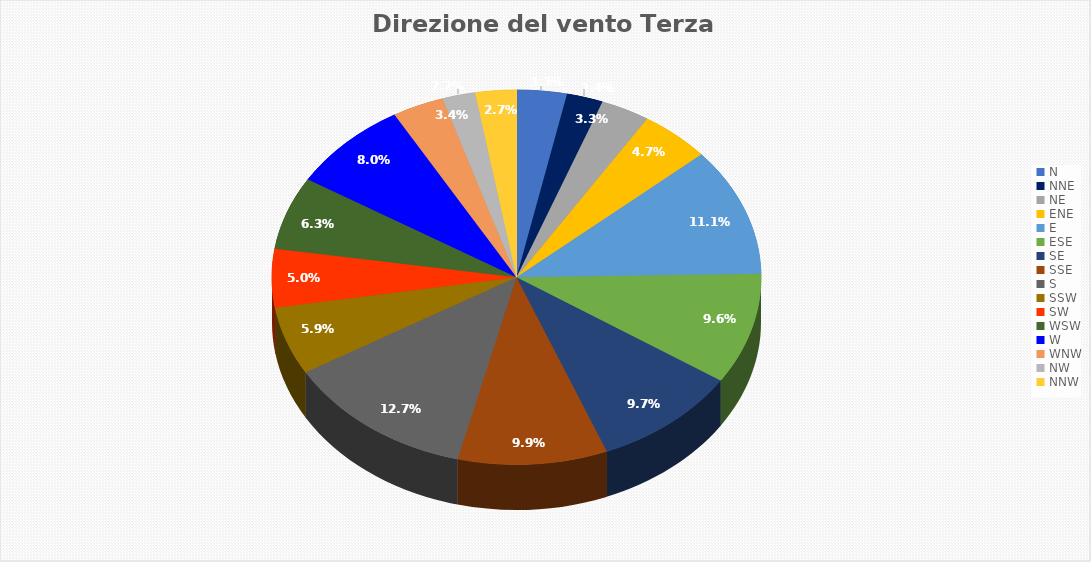
| Category | Percentuale |
|---|---|
| N | 3.313 |
| NNE | 2.398 |
| NE | 3.25 |
| ENE | 4.67 |
| E | 11.076 |
| ESE | 9.593 |
| SE | 9.688 |
| SSE | 9.877 |
| S | 12.654 |
| SSW | 5.869 |
| SW | 5.049 |
| WSW | 6.311 |
| W | 7.952 |
| WNW | 3.408 |
| NW | 2.177 |
| NNW | 2.714 |